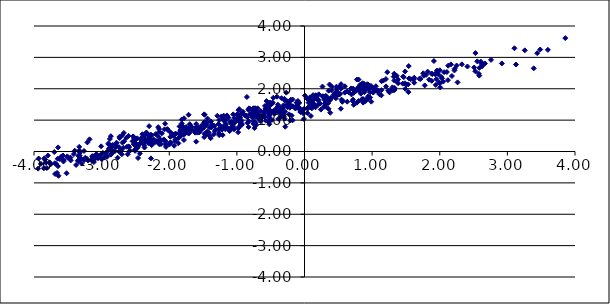
| Category | Series 0 |
|---|---|
| -0.5345420799175258 | 1.361 |
| -4.584378866667721 | -0.819 |
| -2.080273053336895 | 0.384 |
| -2.281800101597672 | 0.281 |
| -1.102226468615318 | 0.939 |
| 2.5551603224611963 | 2.873 |
| -2.39724480246075 | 0.55 |
| -1.7019477738176922 | 0.601 |
| -2.6912130354127357 | 0.284 |
| 0.10401981249186631 | 1.493 |
| -3.8983665054795207 | -0.394 |
| 1.9925711839294995 | 2.201 |
| -0.7680073642832657 | 1.227 |
| -1.601229221515374 | 0.876 |
| 0.9411772951635886 | 1.76 |
| 0.523149119317083 | 1.842 |
| -2.501014546841902 | 0.392 |
| -3.63766258393244 | -0.773 |
| -1.2886308480813211 | 1.139 |
| -3.0075393639452206 | 0.164 |
| -1.1466615405213936 | 1.149 |
| -1.9915717894192004 | 0.277 |
| 0.8864577552975126 | 1.887 |
| -2.846804861193356 | 0.045 |
| -2.417213698880648 | 0.367 |
| 2.58586626116711 | 2.665 |
| 3.257422798596888 | 3.225 |
| -2.542152133342788 | 0.326 |
| -2.4354004826351163 | -0.063 |
| -0.9762465166755894 | 1.32 |
| -2.780730529122113 | 0.19 |
| 1.9677328717676437 | 2.553 |
| -2.070678166166351 | 0.705 |
| 0.8655427772913107 | 1.675 |
| -1.1723065123502139 | 0.71 |
| 0.19596265326940276 | 1.648 |
| -3.4603310281429605 | -0.193 |
| 1.0241571030613317 | 1.922 |
| -0.2312308137410154 | 1.505 |
| -2.74057118041833 | 0.136 |
| -0.35367003820562104 | 1.386 |
| -0.647374042110056 | 1.285 |
| -2.407648826163901 | 0.44 |
| 1.0860969022985834 | 1.938 |
| 0.885638170865402 | 1.939 |
| 1.821305598769226 | 2.546 |
| -2.581156258801842 | 0.025 |
| -0.9658288844433345 | 0.951 |
| -1.568685864803909 | 0.757 |
| -0.778573073563614 | 1.168 |
| -2.229674409209347 | 0.321 |
| -0.5086628781427683 | 1.276 |
| -1.4178700809856208 | 0.608 |
| -1.499936995117364 | 0.874 |
| -0.05490316089815528 | 1.273 |
| 0.824272891976296 | 2.129 |
| -1.6907995486934821 | 0.731 |
| -0.09738533782167413 | 1.61 |
| 0.10560327047044016 | 1.602 |
| -2.3031584359603534 | 0.267 |
| -2.918273234216053 | -0.166 |
| -0.11113439322884144 | 1.57 |
| -0.024787413599676844 | 1.322 |
| -1.3779680091457256 | 0.778 |
| -2.342251738950717 | 0.353 |
| 0.37097741679871055 | 2.135 |
| 0.45035810705960344 | 1.841 |
| -1.0787097920302704 | 0.945 |
| 1.257948400981344 | 1.885 |
| -1.7587439962188731 | 0.68 |
| -3.3350628711190478 | 0.019 |
| -0.39313748638301194 | 1.492 |
| 3.389592852641968 | 2.651 |
| -1.7499722094266341 | 0.751 |
| -1.782109683767998 | 1.059 |
| -1.4338845120548662 | 1.049 |
| -2.1086234104242574 | 0.58 |
| -0.3229420984547353 | 1.39 |
| -2.1502181665761495 | 0.623 |
| 0.4652274464215611 | 1.697 |
| -5.463716664968747 | -0.967 |
| -0.9336671918746872 | 0.991 |
| -5.9172476743464 | -1.388 |
| 0.9248813325431191 | 2.145 |
| -0.9641131413862174 | 1.15 |
| 0.7267855640837761 | 1.968 |
| 2.4097743880606854 | 2.709 |
| -2.601410821696115 | 0.497 |
| -2.7007567298433584 | 0.511 |
| -0.931856732805671 | 1.187 |
| -1.819766745424151 | 0.626 |
| 2.0222439283447935 | 2.374 |
| -2.056281582981655 | 0.226 |
| 0.38033389248818383 | 1.234 |
| -0.05763083442974504 | 1.308 |
| 3.856936938998685 | 3.614 |
| -3.508357666543347 | -0.156 |
| 1.7000974767919894 | 2.319 |
| -1.8605828255345145 | 0.574 |
| -1.4847048234288498 | 1.184 |
| -2.3501751371160946 | 0.55 |
| -0.25067410240209775 | 1.598 |
| -2.1539637393320765 | 0.294 |
| 0.8810482752155928 | 2.055 |
| -1.124692093822407 | 0.715 |
| -5.344017979550583 | -1.202 |
| -2.378437904652216 | 0.242 |
| -0.31017341935756704 | 1.471 |
| 0.21127229319904073 | 1.822 |
| -6.409469807920406 | -2.086 |
| -5.415890680068958 | -1.044 |
| -0.6933273560220177 | 1.376 |
| -3.2408666655908984 | -0.197 |
| -2.6685824277777397 | 0.323 |
| -1.9980767715983756 | 0.224 |
| 1.467217619351576 | 2.369 |
| -1.7131596570962988 | 0.572 |
| -0.4080951950383168 | 1.748 |
| 0.4920112812911366 | 1.816 |
| -4.705933805765746 | -0.424 |
| 1.063826319006246 | 1.933 |
| -4.995631852648957 | -1.504 |
| -1.8363596550785681 | 0.682 |
| -1.0554918999450726 | 0.752 |
| 0.09478980181410979 | 1.132 |
| -0.7120127817586278 | 0.851 |
| -0.6016547676905466 | 1.195 |
| -3.2602528040319148 | 0.017 |
| 2.6065795522734088 | 2.866 |
| -2.7012615396161133 | -0.087 |
| -1.7977345185578155 | 0.792 |
| 1.4876979351477742 | 2.552 |
| 0.6275068345701915 | 1.915 |
| 0.3272239026056707 | 1.554 |
| -1.1465426607077969 | 0.773 |
| -2.2810964706701777 | 0.392 |
| -1.124472122419144 | 1.081 |
| -0.29050008866170673 | 1.626 |
| -3.7681922333631905 | -0.346 |
| -4.342522470002463 | -0.988 |
| 2.063901016358834 | 2.528 |
| -3.410159898260207 | -0.082 |
| 0.7280936942694891 | 1.489 |
| -2.509261503044786 | 0.387 |
| -0.9985029371904084 | 1.177 |
| 0.4027604511527394 | 2.067 |
| 0.9622864676759153 | 2.022 |
| -2.913168479656122 | 0.008 |
| 0.48265285538558245 | 1.908 |
| -1.3879461704580252 | 0.424 |
| -3.8460993959822765 | -0.217 |
| -0.48291966368489336 | 1.004 |
| 1.1374013514980472 | 1.955 |
| -2.212468492485689 | 0.291 |
| -1.8379344807431035 | 0.787 |
| -1.0595415789562006 | 0.919 |
| -3.700213923843473 | -0.016 |
| 2.5086359460333965 | 2.679 |
| -0.010159574963159002 | 1.356 |
| -0.9311281910028469 | 0.893 |
| 0.7287723821640573 | 1.871 |
| -2.878136475271236 | 0.4 |
| -1.9036765314376363 | 0.568 |
| -0.6356391308579412 | 1.093 |
| 0.5049968614585363 | 1.827 |
| -1.453836571753604 | 0.555 |
| -0.8775405120612034 | 1.148 |
| 0.14435016192123462 | 1.507 |
| -0.9264385710605881 | 0.851 |
| -0.9493483494390097 | 0.843 |
| -2.8716490919922197 | 0.184 |
| -2.297503215703779 | 0.808 |
| -3.794282857150364 | -0.128 |
| -1.2278041948502965 | 1.118 |
| -0.5415297761233522 | 1.228 |
| -0.7390952123861538 | 1.206 |
| -0.8109414593105271 | 1.37 |
| -1.6180169352234306 | 0.601 |
| -2.4293093558332535 | 0.262 |
| -1.6162947732474242 | 0.659 |
| -2.805584350210926 | 0.009 |
| -0.008892105465830524 | 1.037 |
| 2.165342249348589 | 2.777 |
| -0.8428000217203511 | 0.913 |
| -0.8449145674294818 | 1.092 |
| -3.320750096440979 | 0.012 |
| 2.217346627010171 | 2.584 |
| -0.3040414575896351 | 1.123 |
| -2.7631249998413914 | -0.198 |
| -1.6122241575294916 | 0.668 |
| -1.4802321174758557 | 0.937 |
| -1.2577754039793194 | 0.733 |
| -0.457590830558684 | 1.3 |
| 0.08076833926157456 | 1.727 |
| 1.2966186049384203 | 1.969 |
| 0.9365075097982738 | 2.098 |
| 2.1052296253611136 | 2.533 |
| 2.12075021150868 | 2.275 |
| -0.9547372886207878 | 1.074 |
| -1.5528949196806652 | 0.613 |
| -0.1904831795665366 | 1.146 |
| 1.1358956134493834 | 1.791 |
| -0.7285933795562545 | 1.099 |
| -0.11275579012835901 | 1.555 |
| -3.330731791708732 | 0.148 |
| -0.4534464049936683 | 1.264 |
| 0.7981471323214262 | 1.608 |
| 0.20105289748546595 | 1.657 |
| 4.596379038243318 | 3.637 |
| -1.5594951503660837 | 0.612 |
| -0.7389919803115295 | 0.746 |
| -1.5294506840954778 | 0.76 |
| -1.1516360214708117 | 1.03 |
| -0.13502934059823757 | 1.429 |
| -0.8226353088590866 | 0.962 |
| 0.8389921807653098 | 2.047 |
| 0.9175148828051034 | 1.664 |
| 0.31871982870373095 | 1.424 |
| -3.518306862911844 | -0.694 |
| -2.3867577598933885 | 0.257 |
| -2.9822382223105333 | -0.043 |
| -3.564165853966218 | -0.318 |
| 0.7949367751068803 | 1.95 |
| 1.3270164918109737 | 2.48 |
| 0.47291384119800517 | 2.065 |
| 0.9011331751699587 | 1.604 |
| -0.7090390395801967 | 1.135 |
| 0.1565071804450473 | 1.735 |
| 0.5644060538205988 | 1.616 |
| -3.2593007055417154 | -0.267 |
| -1.094139238285099 | 0.738 |
| -5.625270230749176 | -1.241 |
| -3.3973003754167506 | 0.026 |
| 0.6546418546433377 | 1.889 |
| -0.5251470342870321 | 0.961 |
| -2.891963069481168 | 0.094 |
| -0.5213115555625605 | 0.87 |
| -3.217105941530101 | -0.234 |
| -2.0485047247179464 | 0.147 |
| -0.7248753537849395 | 0.921 |
| 1.3335672216351844 | 2.024 |
| 1.383088439756142 | 2.298 |
| 0.718609301173422 | 2.004 |
| 0.7987641597562625 | 2.295 |
| -3.8391777605736483 | -0.26 |
| 1.9304230973101868 | 2.47 |
| -0.7286945913896652 | 1.297 |
| -0.27356844744183884 | 1.461 |
| -4.094051811191674 | -0.72 |
| -3.081921788860374 | -0.14 |
| -0.8298037685607278 | 1.333 |
| -0.9474337610855788 | 1.156 |
| 0.85746296946995 | 2.175 |
| -3.649436477741816 | -0.232 |
| 1.3626730888890668 | 2.416 |
| -3.500598801751552 | -0.196 |
| -4.247762661341214 | -0.411 |
| 1.2036401132655694 | 2.308 |
| -0.6516606710022523 | 0.966 |
| -0.7724747977938792 | 1.091 |
| -2.9379745730605977 | -0.06 |
| 3.1270707079815434 | 2.773 |
| -1.165295469100191 | 0.871 |
| -0.9691549945590497 | 0.774 |
| -1.0421342025393794 | 0.707 |
| 2.5247751363892457 | 2.558 |
| 1.0555707881897867 | 2.081 |
| -1.9080748993007217 | 0.385 |
| 0.05949707686171113 | 1.56 |
| -2.305506778827331 | 0.447 |
| -2.0807665967588873 | 0.363 |
| 2.0070584723561113 | 2.042 |
| 1.9789625561399875 | 2.457 |
| -1.4060528439668543 | 0.76 |
| 1.0124976622602833 | 2.015 |
| 0.17089614302610223 | 1.716 |
| -4.3159044701652 | -0.91 |
| 0.43101773450495084 | 1.758 |
| 1.777872949272615 | 2.106 |
| 1.9585517945062016 | 2.582 |
| -1.2098741528572472 | 0.525 |
| 0.8766073679684578 | 2.164 |
| -3.3242194157271796 | -0.261 |
| -4.623478110105081 | -0.833 |
| -0.9098538832112135 | 1.267 |
| 0.6953299759535672 | 1.819 |
| -3.620903646365609 | -0.241 |
| -0.7652670343354466 | 1.311 |
| 0.029247546770323485 | 1.701 |
| -0.5600184040737237 | 1.376 |
| -2.36810195158101 | 0.194 |
| -3.750751822627293 | -0.402 |
| -4.084443939586572 | -0.837 |
| -1.0273635066183358 | 0.932 |
| -1.441030028868959 | 0.631 |
| 0.9875195693916587 | 1.588 |
| -2.366188565333008 | 0.127 |
| -3.688297251035704 | -0.716 |
| -1.1075422548240956 | 0.651 |
| 4.2439847136510656 | 3.32 |
| 0.6882733422068843 | 2.011 |
| -1.205502503262452 | 1.092 |
| 0.5478553771865886 | 1.653 |
| 1.0162529862044511 | 1.878 |
| -2.1221091647848556 | 0.239 |
| -2.737695068875063 | 0.464 |
| -0.7292476266158902 | 1.379 |
| -3.1141994103894226 | -0.337 |
| 2.5845721578885117 | 2.418 |
| -0.803563876000827 | 1.204 |
| 0.9699821441514165 | 1.722 |
| -0.7302535027531882 | 1.314 |
| -1.6647133284824431 | 0.772 |
| -1.0545914616267533 | 1.184 |
| -2.6717175286799644 | 0.591 |
| 0.05435598279962517 | 1.658 |
| -7.119124337514906 | -2.152 |
| 0.20332633273981204 | 1.628 |
| 0.10812285320205328 | 1.375 |
| -1.0719826979094143 | 0.86 |
| -0.060810532831464315 | 1.257 |
| -3.6008197481002178 | -0.172 |
| -1.8648976638507693 | 0.261 |
| 1.2057627362773387 | 2.074 |
| -1.037544664551841 | 1.059 |
| -2.0615791674410664 | 0.886 |
| 2.6160658584527265 | 2.8 |
| 0.7573230560357511 | 1.927 |
| -2.1589001506743184 | 0.472 |
| -2.7133174615319477 | 0.025 |
| -1.8337517307240931 | 0.484 |
| 0.1176631368413612 | 1.425 |
| -0.28640348625939005 | 1.264 |
| -4.606365898935802 | -0.509 |
| -0.5443819579692243 | 1.288 |
| -3.1226052096975794 | -0.183 |
| -0.9543503685158402 | 1.092 |
| -3.5726464073635547 | -0.127 |
| -0.4883997693945775 | 1.273 |
| -1.1676840671496729 | 0.857 |
| -3.339546872734043 | -0.311 |
| -0.2098461983055382 | 0.99 |
| -0.0793082750511438 | 1.402 |
| -0.5614917121016882 | 1.607 |
| -3.7564649892527786 | -0.401 |
| -2.359143294025313 | 0.54 |
| -3.377452254257552 | -0.428 |
| 1.6227843916760527 | 2.353 |
| 0.8336869738296202 | 1.843 |
| 2.5280091491996277 | 3.137 |
| 0.4011376659614536 | 1.945 |
| 1.3273116151585493 | 2.263 |
| -3.3224436820308596 | -0.041 |
| -0.20270192035406198 | 1.65 |
| 1.9508131885661895 | 2.303 |
| -1.600055953828885 | 0.755 |
| 0.47983728120087 | 1.969 |
| 1.319115312285784 | 2.385 |
| -3.099096369151326 | -0.236 |
| 0.5411134705013665 | 2.004 |
| -1.476472645759098 | 1.173 |
| -1.8149001913951504 | 0.894 |
| -0.9645069123177947 | 1.351 |
| -0.5839142292814619 | 1.453 |
| -0.9727710608251094 | 1.058 |
| 0.43412924490396665 | 1.814 |
| 0.3396004296404529 | 1.712 |
| 0.9433215657000034 | 2.128 |
| -0.10041283508179955 | 1.528 |
| -2.3638986852125976 | 0.396 |
| -5.88604390100363 | -1.331 |
| 0.23263638901801054 | 1.528 |
| -2.7977906131512147 | 0.145 |
| 2.0343455127352073 | 2.333 |
| -5.2749037153717815 | -1.171 |
| -2.2314255360998025 | 0.302 |
| -2.5339411743458626 | 0.482 |
| 0.8480263326781747 | 1.662 |
| -5.657443379504592 | -1.606 |
| -5.060224940707203 | -1.038 |
| 0.9391584488145495 | 1.7 |
| -0.07898711847727402 | 1.37 |
| -3.343564092211352 | -0.138 |
| -2.870067486583573 | 0.065 |
| 0.12717529305687947 | 1.797 |
| -0.5232839481863416 | 1.557 |
| -4.029390433751914 | -0.559 |
| -0.36502198869815505 | 1.389 |
| 1.5462592131797561 | 2.329 |
| -1.9596957208934875 | 0.559 |
| -1.5252761872361682 | 0.694 |
| -1.688258882011279 | 0.693 |
| -2.2976523643936293 | 0.491 |
| 0.8695111494574244 | 2.08 |
| -0.1870430095611848 | 1.44 |
| -0.7541921137617943 | 1.178 |
| 0.9397723769885868 | 1.983 |
| -3.4571397836630386 | -0.283 |
| -2.842489488631001 | 0.182 |
| -1.9282994625850305 | 0.519 |
| -1.767635409372133 | 0.566 |
| -0.5719756125743309 | 0.982 |
| 1.6147847765513195 | 2.301 |
| 0.38277809630142645 | 1.649 |
| 1.6225922370345107 | 2.193 |
| -0.7536714894268997 | 0.961 |
| 0.97022905601365 | 1.887 |
| 1.1657101997522612 | 2.261 |
| -5.8648371479712 | -1.207 |
| 0.5178842828386896 | 2.058 |
| -0.2261967465842495 | 1.55 |
| 0.3575780453484805 | 1.938 |
| -2.635557308841987 | 0.435 |
| 1.1398514862626725 | 2.24 |
| -1.599129006941541 | 0.694 |
| 0.35248185759436534 | 1.598 |
| 0.39033629422560256 | 1.711 |
| -2.470813895148654 | 0.184 |
| 1.30544216323241 | 1.946 |
| 2.179894950437693 | 2.405 |
| 0.2912497766714386 | 1.671 |
| -5.057978467964182 | -0.89 |
| 4.18601147840276 | 3.475 |
| -2.89314510923703 | 0.225 |
| 1.7552136373409502 | 2.493 |
| -1.4346979875311634 | 0.563 |
| -0.8202464235843568 | 1.376 |
| -3.8111725435696693 | -0.526 |
| -0.9441088411562255 | 0.949 |
| 0.5977657589947063 | 2.078 |
| -1.4835001570899593 | 0.459 |
| -0.01604364490377741 | 1.211 |
| 1.9139339690278452 | 2.884 |
| -2.3061504186851005 | 0.532 |
| -1.3717022757526913 | 0.872 |
| -2.2292399341248164 | 0.382 |
| -3.6441392929862433 | 0.131 |
| -4.426382437470301 | -0.585 |
| -3.325808791001383 | -0.127 |
| -2.4992743139847615 | 0.269 |
| 3.5990082918201214 | 3.239 |
| -1.8149113700313961 | 1.02 |
| 0.4786628739690124 | 1.834 |
| -3.6920684908496098 | -0.374 |
| -1.4249064216779392 | 0.582 |
| -1.1862083050048406 | 0.782 |
| -1.5409163155308767 | 0.789 |
| -5.325647040513821 | -1.488 |
| 0.942168639085996 | 2.03 |
| -2.8379689530360013 | 0.205 |
| -2.5199493320286472 | 0.426 |
| 0.30194625464056846 | 1.633 |
| -1.2622065079370095 | 1.002 |
| 1.1084419677615793 | 1.826 |
| -1.805013919977248 | 0.607 |
| -0.049007188726324924 | 1.298 |
| -1.9771424900338377 | 0.285 |
| 0.3503050043227627 | 1.544 |
| -4.389153958077983 | -0.687 |
| -2.7778378365837124 | 0.279 |
| -1.2638086503842763 | 0.575 |
| -3.3051223911470466 | -0.229 |
| -1.0504649751615276 | 0.797 |
| -1.9150212869507595 | 0.554 |
| 0.8674949673682049 | 1.558 |
| -3.9309218078373487 | -0.223 |
| 1.9351988425352888 | 2.466 |
| -4.106172031485597 | -0.448 |
| -4.103256115637789 | -0.732 |
| 1.5408902132933284 | 2.723 |
| 0.31474949070371183 | 1.776 |
| -1.9761439175300077 | 0.6 |
| 1.3314920063530078 | 1.96 |
| -0.4094056582787541 | 1.355 |
| 0.26454280677104025 | 1.759 |
| 0.9372055194005771 | 2.025 |
| -0.6411929689588785 | 1.064 |
| -1.8284126141354058 | 0.569 |
| -0.32153985291737786 | 1.306 |
| 0.9822377152832655 | 2.09 |
| -0.7559348098780081 | 1.38 |
| -2.594681634214356 | 0.138 |
| -0.7066417626710739 | 1.135 |
| -3.559604480974669 | -0.271 |
| -1.1880110716133925 | 0.984 |
| -0.8510741957543512 | 1.738 |
| -2.627188538911276 | 0.149 |
| 0.04456662864021288 | 1.389 |
| -1.3964103322755872 | 0.475 |
| 2.00121988765871 | 2.59 |
| -0.29689114829585117 | 1.68 |
| -2.0542613439369557 | 0.331 |
| 3.4413998940464623 | 3.134 |
| -2.858159756130886 | 0.068 |
| -2.8881794193643646 | 0.211 |
| 0.046208683214325585 | 1.367 |
| -3.8244851158321125 | -0.355 |
| -1.3747159967653224 | 0.773 |
| -4.247382291513464 | -0.72 |
| -2.6144699821769852 | -0.089 |
| 2.0507550518368114 | 2.227 |
| 0.15773171708194167 | 1.718 |
| -0.07817330482724438 | 1.549 |
| -1.6082182992668586 | 0.635 |
| 0.7127996666933953 | 1.606 |
| 0.24232353300638243 | 1.335 |
| 2.918264860950904 | 2.806 |
| -1.227653602038252 | 0.799 |
| -1.6839795974483547 | 0.676 |
| 0.8325228528268132 | 1.983 |
| -2.599749269919885 | 0.163 |
| -1.194270049672559 | 1.14 |
| -3.65862993298504 | -0.682 |
| -1.3319961558425948 | 0.818 |
| 0.9763761186903346 | 2.061 |
| -0.9801134409459938 | 0.741 |
| 0.35526620706123224 | 1.361 |
| -1.3128374391923296 | 0.695 |
| -0.9064531318430301 | 1.206 |
| -0.33982800584195205 | 1.7 |
| -0.7487051840820544 | 0.903 |
| 2.5783068686748427 | 2.476 |
| 0.16605408978845992 | 1.793 |
| 1.8795622526306013 | 2.483 |
| 1.3638082729137246 | 2.244 |
| -0.8263609292723575 | 0.783 |
| 0.7751067786072934 | 2.293 |
| -0.5911568818006868 | 1.108 |
| 0.6323220926590709 | 1.588 |
| -0.25266234351386974 | 1.41 |
| -1.6801478894728457 | 0.807 |
| 2.2491450508553776 | 2.74 |
| -2.2612793039003174 | 0.506 |
| 1.7979978615790526 | 2.442 |
| -1.6966889992562406 | 0.871 |
| -0.46862155388428317 | 1.555 |
| 0.7454425365931157 | 1.923 |
| -2.073187103096936 | 0.373 |
| -3.0047582969359254 | -0.238 |
| -2.1855115435736527 | 0.33 |
| 3.485323294805136 | 3.252 |
| -4.411989772009216 | -0.583 |
| 3.1046816919703293 | 3.29 |
| -0.7300867222531138 | 1.352 |
| -2.3371900763493083 | 0.348 |
| 0.5584818721837903 | 1.585 |
| 1.5019358532385523 | 2.137 |
| -0.5347448161812863 | 1.471 |
| -0.7525782970382698 | 0.881 |
| -0.5888521776338554 | 1.103 |
| -2.201186948771807 | 0.553 |
| -1.2037312893061858 | 1.004 |
| -2.4630310889292586 | 0.16 |
| -2.3959905819625558 | 0.38 |
| -0.5970054770883679 | 1.264 |
| -0.5238139087798187 | 1.083 |
| 0.16255060447409586 | 1.409 |
| -2.163449174972186 | 0.777 |
| -0.858875044785713 | 1.14 |
| -0.1758246991193846 | 0.993 |
| -1.4756369216725012 | 0.845 |
| -0.5615215577366319 | 1.45 |
| 1.762703450523115 | 2.417 |
| -1.7136817815632173 | 1.17 |
| -1.7502568226258737 | 0.779 |
| 2.327790634265113 | 2.779 |
| -0.3167945783793621 | 1.219 |
| 1.384344032589501 | 2.177 |
| -1.585531460120487 | 0.602 |
| 0.7925930947220186 | 2.04 |
| -0.6756283900548656 | 1.169 |
| -3.1400918311743102 | -0.15 |
| -1.4882699982061431 | 0.761 |
| -4.623587242740999 | -0.515 |
| -4.058306994003354 | -0.495 |
| -2.9627411742226952 | -0.193 |
| 1.239520168791317 | 1.939 |
| -1.326135405443235 | 0.65 |
| -2.149966900923701 | 0.719 |
| -4.243926756299032 | -0.666 |
| -1.7133317586631742 | 0.728 |
| -0.5306868000794245 | 0.951 |
| -2.1451474523288727 | 0.229 |
| -0.3440747499349661 | 1.196 |
| -1.2628421691456386 | 0.684 |
| -3.1518015252759497 | -0.275 |
| -5.29423908067756 | -1.377 |
| -2.506435793441395 | 0.19 |
| 0.287933022077026 | 1.425 |
| -0.408612091436628 | 1.397 |
| -2.7173480077430314 | 0.011 |
| 2.0018021873338205 | 2.177 |
| 1.9412221603876736 | 2.121 |
| 1.8897301040947858 | 2.466 |
| 2.2638850498106193 | 2.204 |
| -0.26937066553749645 | 1.876 |
| 0.5372743570405578 | 1.364 |
| -0.5730540538417802 | 1.375 |
| 0.0996528420544085 | 1.596 |
| -3.352208424673045 | -0.293 |
| 1.4587703430310324 | 2.388 |
| 1.3000916366097823 | 2.045 |
| -0.28455376887015604 | 0.789 |
| -2.4726976601926474 | 0.42 |
| -2.380047317942625 | 0.347 |
| -2.7863074439827384 | 0.26 |
| -2.270369930212496 | 0.537 |
| 0.8887706689333033 | 2.002 |
| -0.9913101228783534 | 1.183 |
| 1.4901864144780945 | 1.998 |
| -0.9808416264426765 | 0.615 |
| -0.39571945300345956 | 1.281 |
| 2.6679491658533547 | 2.805 |
| -2.7413638522700383 | 0.001 |
| -0.9816508637771444 | 1.022 |
| 0.042381181040466176 | 1.226 |
| 1.5710109480052563 | 2.304 |
| -3.644967401540622 | -0.469 |
| 0.8234127297651126 | 2.084 |
| -0.35472874648082087 | 1.09 |
| -1.5061604822673034 | 0.784 |
| -2.5153370527207017 | 0.298 |
| 0.005706062372723419 | 1.782 |
| -0.38661966777177414 | 1.041 |
| -1.6027490217908165 | 0.765 |
| -0.518888115686784 | 1.327 |
| -2.863989846375685 | -0.1 |
| 0.4459504927753677 | 1.82 |
| -0.2939158488015029 | 1.046 |
| 0.0626188069173863 | 1.41 |
| -1.0986435403408872 | 0.72 |
| -1.4438586469784658 | 0.927 |
| -0.7041499835829845 | 1.261 |
| -3.0536050557093284 | -0.216 |
| 1.4853627859449743 | 2.173 |
| -0.46130915214696744 | 1.712 |
| -2.0137250960483177 | 0.673 |
| -0.5555522767239276 | 1.454 |
| 1.8820331740012777 | 2.253 |
| 1.715768118963557 | 2.312 |
| -1.541219714648168 | 0.679 |
| -1.9828423756510878 | 0.467 |
| -3.6094904703035287 | -0.223 |
| -0.6789526353463091 | 1.049 |
| -4.09713348033032 | -0.158 |
| -2.841255270334533 | -0.04 |
| -0.9432200542629301 | 1.19 |
| -0.5065198789225125 | 1.209 |
| -2.338377360295205 | 0.607 |
| -2.8637118527115897 | 0.489 |
| -1.4521701365940882 | 0.845 |
| -0.49053916046991464 | 1.504 |
| -3.0770959285112407 | -0.082 |
| -2.3705426941019017 | 0.404 |
| 0.26568944596928 | 2.07 |
| -0.10383696223478944 | 1.408 |
| 1.2241832921045441 | 2.528 |
| -4.293387440034874 | -0.825 |
| -0.25779160331029694 | 1.453 |
| -4.768953870955401 | -0.84 |
| 0.7177507187765615 | 1.652 |
| 1.5370999783345223 | 1.893 |
| -3.8558613493484812 | -0.537 |
| -3.178610352575419 | 0.388 |
| -1.9140902152092423 | 0.331 |
| -1.8643066327914284 | 0.425 |
| -4.713195279210364 | -0.911 |
| 2.124389502216546 | 2.734 |
| 2.6249264727234833 | 2.712 |
| -1.6724616325951955 | 0.691 |
| 1.4532568267684933 | 2.163 |
| -2.0270914508362754 | 0.713 |
| -3.9393468179352435 | -0.546 |
| -0.3917362973293912 | 1.27 |
| -1.8016588595106895 | 0.655 |
| 4.416791171502678 | 3.611 |
| -2.525279845538835 | 0.234 |
| 1.5329402379607178 | 2.139 |
| -3.67299767585627 | -0.396 |
| -2.734725918122163 | 0.429 |
| -1.2617566950551777 | 0.521 |
| -2.4690955043440486 | 0.12 |
| 4.835545828696494 | 3.437 |
| -0.5720997982651159 | 1.356 |
| -1.8471678124993338 | 0.799 |
| -0.4976776800789795 | 1.554 |
| -1.928077804386096 | 0.183 |
| -1.6010681548632522 | 0.315 |
| -0.9939340069506102 | 1.017 |
| 0.5957691981887983 | 1.877 |
| -1.8417656847965005 | 0.601 |
| 0.5198602635904295 | 1.82 |
| -0.5061140293592675 | 1.473 |
| 0.7742140263498776 | 1.554 |
| -0.5184004086256637 | 1.143 |
| -1.3407729525558696 | 0.551 |
| -1.9438046548535777 | 0.505 |
| -1.745748753929577 | 0.611 |
| -4.756498550913159 | -1.126 |
| -6.56932305241134 | -1.405 |
| -2.789517270196641 | 0.138 |
| -3.1991707229813353 | -0.288 |
| -0.21608789835607922 | 1.394 |
| -2.2605004583551747 | 0.203 |
| 0.3013299280169244 | 1.528 |
| -2.678429541097477 | 0.12 |
| -0.36091673243904077 | 1.229 |
| 0.5403406563027195 | 2.146 |
| -1.2707699075529444 | 0.874 |
| 0.5067789117443293 | 1.817 |
| -2.270235630957398 | -0.219 |
| -1.2185739707904328 | 0.699 |
| 0.20109199531214994 | 1.488 |
| -4.1541754246591225 | -0.535 |
| -0.574737859300098 | 1.351 |
| -2.8985758937427213 | 0.256 |
| -2.5049861724263245 | 0.021 |
| -3.210655490025013 | 0.29 |
| -2.3791477981588782 | 0.496 |
| -3.1292521024821274 | -0.176 |
| -3.0181882381416694 | -0.117 |
| -3.257622687271566 | -0.268 |
| -3.295651658438341 | -0.385 |
| 0.2773668898529218 | 1.76 |
| 2.75812904812866 | 2.921 |
| -1.4787241976967884 | 0.565 |
| -0.1761446286653151 | 1.658 |
| 0.9379460423542085 | 1.673 |
| 0.14707268639497073 | 1.677 |
| -4.650321806636557 | -0.812 |
| -2.1270145061716295 | 0.373 |
| -2.4614280802748434 | -0.207 |
| 0.2912305789482308 | 1.725 |
| -5.337712886672529 | -1.198 |
| -1.78637992260491 | 0.541 |
| -3.1277188349763385 | -0.151 |
| -1.7827637472610802 | 0.367 |
| -0.22564166515188555 | 1.183 |
| 2.2204385667244835 | 2.641 |
| -0.17444901553564185 | 1.443 |
| -0.13382038297558418 | 1.369 |
| -1.0645204966613468 | 0.886 |
| 1.8437109975179125 | 2.29 |
| -0.9769354244490311 | 1.055 |
| -0.44517570431556563 | 1.208 |
| -1.3824812285565187 | 0.955 |
| -2.509402182716224 | 0.055 |